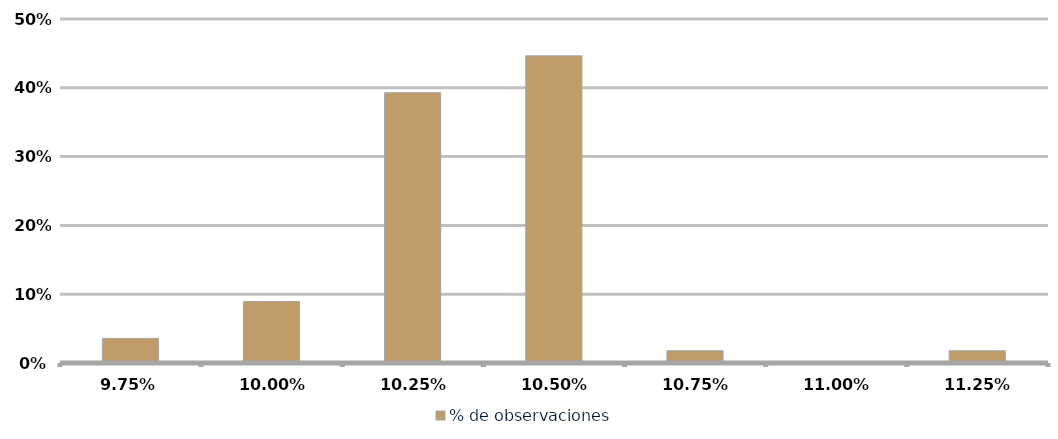
| Category | % de observaciones  |
|---|---|
| 0.0975 | 0.036 |
| 0.1 | 0.089 |
| 0.10250000000000001 | 0.393 |
| 0.10500000000000001 | 0.446 |
| 0.10750000000000001 | 0.018 |
| 0.11000000000000001 | 0 |
| 0.11250000000000002 | 0.018 |